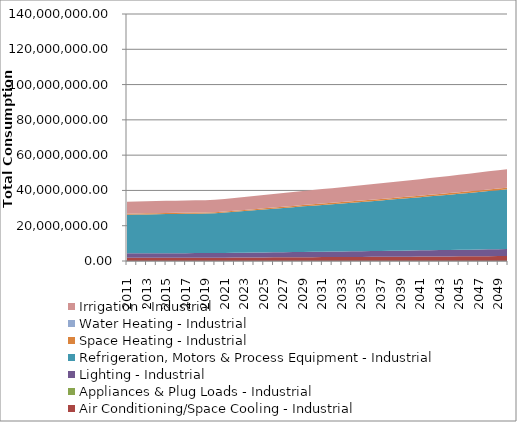
| Category | Air Conditioning/Space Cooling - Industrial | Appliances & Plug Loads - Industrial | Lighting - Industrial | Refrigeration, Motors & Process Equipment - Industrial | Space Heating - Industrial | Water Heating - Industrial | Irrigation - Industrial |
|---|---|---|---|---|---|---|---|
| 2011.0 | 1818449.282 | 0 | 2548311.885 | 21835361.02 | 606149.776 | 0 | 6791946.652 |
| 2012.0 | 1825408.571 | 0 | 2558064.391 | 21918925.944 | 608469.539 | 0 | 6817939.742 |
| 2013.0 | 1832104.672 | 0 | 2567448.075 | 21999330.6 | 610701.572 | 0 | 6842949.823 |
| 2014.0 | 1838526.971 | 0 | 2576448.062 | 22076447.518 | 612842.339 | 0 | 6866937.244 |
| 2015.0 | 1844664.568 | 0 | 2585049.079 | 22150145.842 | 614888.205 | 0 | 6889861.302 |
| 2016.0 | 1850506.279 | 0 | 2593235.45 | 22220291.246 | 616835.441 | 0 | 6911680.215 |
| 2017.0 | 1856040.62 | 0 | 2600991.084 | 22286745.854 | 618680.222 | 0 | 6932351.096 |
| 2018.0 | 1861255.807 | 0 | 2608299.467 | 22349368.164 | 620418.618 | 0 | 6951829.931 |
| 2019.0 | 1866139.747 | 0 | 2615143.651 | 22408012.956 | 622046.597 | 0 | 6970071.548 |
| 2020.0 | 1876381.879 | 0 | 2629496.62 | 22530997.224 | 625460.642 | 0 | 7008326.129 |
| 2021.0 | 1905258.511 | 0 | 2669963.333 | 22877738.647 | 635086.186 | 0 | 7116180.963 |
| 2022.0 | 1934504.897 | 0 | 2710948.207 | 23228919.957 | 644834.982 | 0 | 7225416.836 |
| 2023.0 | 1964124.549 | 0 | 2752456.161 | 23584583.319 | 654708.199 | 0 | 7336046.863 |
| 2024.0 | 1994120.983 | 0 | 2794492.125 | 23944770.963 | 664707.011 | 0 | 7448084.18 |
| 2025.0 | 2024497.72 | 0 | 2837061.034 | 24309525.173 | 674832.59 | 0 | 7561541.94 |
| 2026.0 | 2055258.287 | 0 | 2880167.827 | 24678888.277 | 685086.112 | 0 | 7676433.308 |
| 2027.0 | 2086406.209 | 0 | 2923817.448 | 25052902.633 | 695468.754 | 0 | 7792771.46 |
| 2028.0 | 2117945.018 | 0 | 2968014.842 | 25431610.621 | 705981.69 | 0 | 7910569.579 |
| 2029.0 | 2149878.242 | 0 | 3012764.957 | 25815054.624 | 716626.098 | 0 | 8029840.847 |
| 2030.0 | 2177898.754 | 0 | 3052031.934 | 26151516.034 | 725966.269 | 0 | 8134498.057 |
| 2031.0 | 2206284.473 | 0 | 3091810.698 | 26492362.725 | 735428.176 | 0 | 8240519.319 |
| 2032.0 | 2235040.158 | 0 | 3132107.92 | 26837651.854 | 745013.404 | 0 | 8347922.414 |
| 2033.0 | 2264170.632 | 0 | 3172930.357 | 27187441.32 | 754723.563 | 0 | 8456725.35 |
| 2034.0 | 2293680.778 | 0 | 3214284.855 | 27541789.78 | 764560.278 | 0 | 8566946.373 |
| 2035.0 | 2323575.546 | 0 | 3256178.348 | 27900756.652 | 774525.201 | 0 | 8678603.966 |
| 2036.0 | 2353859.949 | 0 | 3298617.861 | 28264402.132 | 784620.002 | 0 | 8791716.852 |
| 2037.0 | 2384539.064 | 0 | 3341610.512 | 28632787.197 | 794846.374 | 0 | 8906303.998 |
| 2038.0 | 2415618.037 | 0 | 3385163.508 | 29005973.622 | 805206.032 | 0 | 9022384.62 |
| 2039.0 | 2447102.078 | 0 | 3429284.154 | 29384023.986 | 815700.713 | 0 | 9139978.183 |
| 2040.0 | 2478996.468 | 0 | 3473979.848 | 29767001.681 | 826332.176 | 0 | 9259104.406 |
| 2041.0 | 2511306.554 | 0 | 3519258.085 | 30154970.93 | 837102.205 | 0 | 9379783.264 |
| 2042.0 | 2544037.756 | 0 | 3565126.457 | 30547996.79 | 848012.606 | 0 | 9502034.995 |
| 2043.0 | 2577195.56 | 0 | 3611592.657 | 30946145.166 | 859065.208 | 0 | 9625880.098 |
| 2044.0 | 2610785.528 | 0 | 3658664.475 | 31349482.822 | 870261.864 | 0 | 9751339.34 |
| 2045.0 | 2644813.291 | 0 | 3706349.805 | 31758077.394 | 881604.452 | 0 | 9878433.759 |
| 2046.0 | 2679284.557 | 0 | 3754656.644 | 32171997.397 | 893094.874 | 0 | 10007184.668 |
| 2047.0 | 2714205.105 | 0 | 3803593.091 | 32591312.241 | 904735.057 | 0 | 10137613.657 |
| 2048.0 | 2749580.792 | 0 | 3853167.354 | 33016092.24 | 916526.953 | 0 | 10269742.596 |
| 2049.0 | 2785417.548 | 0 | 3903387.744 | 33446408.623 | 928472.539 | 0 | 10403593.642 |
| 2050.0 | 2821721.385 | 0 | 3954262.684 | 33882333.55 | 940573.818 | 0 | 10539189.241 |